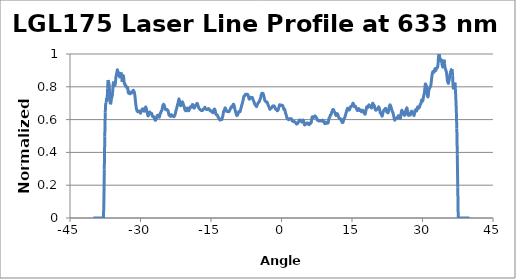
| Category | Normalized Intensity |
|---|---|
| -40.0 | 0 |
| -39.9 | 0 |
| -39.8 | 0 |
| -39.7 | 0 |
| -39.6 | 0 |
| -39.5 | 0 |
| -39.4 | 0 |
| -39.3 | 0 |
| -39.2 | 0 |
| -39.1 | 0 |
| -39.0 | 0 |
| -38.9 | 0 |
| -38.8 | 0 |
| -38.7 | 0 |
| -38.6 | 0 |
| -38.5 | 0 |
| -38.4 | 0 |
| -38.3 | 0 |
| -38.2 | 0 |
| -38.1 | 0 |
| -38.0 | 0 |
| -37.9 | 0 |
| -37.8 | 0.079 |
| -37.7 | 0.297 |
| -37.6 | 0.495 |
| -37.5 | 0.642 |
| -37.4 | 0.703 |
| -37.3 | 0.703 |
| -37.2 | 0.733 |
| -37.1 | 0.712 |
| -37.0 | 0.789 |
| -36.9 | 0.841 |
| -36.8 | 0.832 |
| -36.7 | 0.822 |
| -36.6 | 0.78 |
| -36.5 | 0.723 |
| -36.4 | 0.693 |
| -36.3 | 0.701 |
| -36.2 | 0.725 |
| -36.1 | 0.736 |
| -36.0 | 0.748 |
| -35.9 | 0.778 |
| -35.8 | 0.825 |
| -35.7 | 0.832 |
| -35.6 | 0.816 |
| -35.5 | 0.81 |
| -35.4 | 0.811 |
| -35.3 | 0.836 |
| -35.2 | 0.865 |
| -35.1 | 0.877 |
| -35.0 | 0.893 |
| -34.9 | 0.904 |
| -34.8 | 0.89 |
| -34.7 | 0.888 |
| -34.6 | 0.882 |
| -34.5 | 0.863 |
| -34.4 | 0.862 |
| -34.3 | 0.874 |
| -34.2 | 0.882 |
| -34.1 | 0.888 |
| -34.0 | 0.858 |
| -33.9 | 0.83 |
| -33.8 | 0.841 |
| -33.7 | 0.866 |
| -33.6 | 0.862 |
| -33.5 | 0.832 |
| -33.4 | 0.818 |
| -33.3 | 0.818 |
| -33.2 | 0.805 |
| -33.1 | 0.803 |
| -33.0 | 0.802 |
| -32.9 | 0.794 |
| -32.8 | 0.797 |
| -32.7 | 0.788 |
| -32.6 | 0.766 |
| -32.5 | 0.761 |
| -32.4 | 0.77 |
| -32.3 | 0.759 |
| -32.2 | 0.758 |
| -32.1 | 0.763 |
| -32.0 | 0.761 |
| -31.9 | 0.763 |
| -31.8 | 0.769 |
| -31.7 | 0.772 |
| -31.6 | 0.777 |
| -31.5 | 0.778 |
| -31.4 | 0.772 |
| -31.3 | 0.766 |
| -31.2 | 0.747 |
| -31.1 | 0.72 |
| -31.0 | 0.693 |
| -30.9 | 0.671 |
| -30.8 | 0.659 |
| -30.7 | 0.653 |
| -30.6 | 0.648 |
| -30.5 | 0.648 |
| -30.4 | 0.653 |
| -30.3 | 0.651 |
| -30.2 | 0.653 |
| -30.1 | 0.646 |
| -30.0 | 0.638 |
| -29.9 | 0.645 |
| -29.8 | 0.654 |
| -29.7 | 0.659 |
| -29.6 | 0.665 |
| -29.5 | 0.664 |
| -29.4 | 0.665 |
| -29.3 | 0.657 |
| -29.2 | 0.651 |
| -29.1 | 0.66 |
| -29.0 | 0.67 |
| -28.9 | 0.678 |
| -28.8 | 0.671 |
| -28.7 | 0.66 |
| -28.6 | 0.645 |
| -28.5 | 0.632 |
| -28.4 | 0.623 |
| -28.3 | 0.626 |
| -28.2 | 0.635 |
| -28.1 | 0.645 |
| -28.0 | 0.646 |
| -27.9 | 0.642 |
| -27.8 | 0.635 |
| -27.7 | 0.637 |
| -27.6 | 0.637 |
| -27.5 | 0.626 |
| -27.4 | 0.618 |
| -27.3 | 0.616 |
| -27.2 | 0.618 |
| -27.1 | 0.613 |
| -27.0 | 0.605 |
| -26.9 | 0.597 |
| -26.8 | 0.596 |
| -26.7 | 0.602 |
| -26.6 | 0.608 |
| -26.5 | 0.621 |
| -26.4 | 0.626 |
| -26.3 | 0.626 |
| -26.2 | 0.623 |
| -26.1 | 0.618 |
| -26.0 | 0.615 |
| -25.9 | 0.624 |
| -25.8 | 0.638 |
| -25.7 | 0.64 |
| -25.6 | 0.651 |
| -25.5 | 0.654 |
| -25.4 | 0.662 |
| -25.3 | 0.678 |
| -25.2 | 0.689 |
| -25.1 | 0.693 |
| -25.0 | 0.69 |
| -24.9 | 0.682 |
| -24.8 | 0.671 |
| -24.7 | 0.664 |
| -24.6 | 0.66 |
| -24.5 | 0.662 |
| -24.4 | 0.662 |
| -24.3 | 0.659 |
| -24.2 | 0.657 |
| -24.1 | 0.651 |
| -24.0 | 0.634 |
| -23.9 | 0.626 |
| -23.8 | 0.63 |
| -23.7 | 0.629 |
| -23.6 | 0.62 |
| -23.5 | 0.623 |
| -23.4 | 0.629 |
| -23.3 | 0.627 |
| -23.2 | 0.623 |
| -23.1 | 0.621 |
| -23.0 | 0.62 |
| -22.9 | 0.618 |
| -22.8 | 0.621 |
| -22.7 | 0.626 |
| -22.6 | 0.635 |
| -22.5 | 0.649 |
| -22.4 | 0.66 |
| -22.3 | 0.67 |
| -22.2 | 0.681 |
| -22.1 | 0.693 |
| -22.0 | 0.701 |
| -21.9 | 0.715 |
| -21.8 | 0.726 |
| -21.7 | 0.714 |
| -21.6 | 0.693 |
| -21.5 | 0.686 |
| -21.4 | 0.686 |
| -21.3 | 0.69 |
| -21.2 | 0.703 |
| -21.1 | 0.709 |
| -21.0 | 0.703 |
| -20.9 | 0.695 |
| -20.8 | 0.686 |
| -20.7 | 0.678 |
| -20.6 | 0.667 |
| -20.5 | 0.657 |
| -20.4 | 0.654 |
| -20.3 | 0.654 |
| -20.2 | 0.659 |
| -20.1 | 0.668 |
| -20.0 | 0.67 |
| -19.9 | 0.662 |
| -19.8 | 0.654 |
| -19.7 | 0.656 |
| -19.6 | 0.664 |
| -19.5 | 0.673 |
| -19.4 | 0.678 |
| -19.3 | 0.678 |
| -19.2 | 0.676 |
| -19.1 | 0.676 |
| -19.0 | 0.689 |
| -18.9 | 0.692 |
| -18.8 | 0.684 |
| -18.7 | 0.675 |
| -18.6 | 0.67 |
| -18.5 | 0.673 |
| -18.4 | 0.679 |
| -18.3 | 0.686 |
| -18.2 | 0.69 |
| -18.1 | 0.693 |
| -18.0 | 0.698 |
| -17.9 | 0.698 |
| -17.8 | 0.689 |
| -17.7 | 0.679 |
| -17.6 | 0.671 |
| -17.5 | 0.668 |
| -17.4 | 0.664 |
| -17.3 | 0.66 |
| -17.2 | 0.659 |
| -17.1 | 0.656 |
| -17.0 | 0.657 |
| -16.9 | 0.657 |
| -16.8 | 0.656 |
| -16.7 | 0.662 |
| -16.6 | 0.664 |
| -16.5 | 0.667 |
| -16.4 | 0.67 |
| -16.3 | 0.676 |
| -16.2 | 0.668 |
| -16.1 | 0.664 |
| -16.0 | 0.664 |
| -15.9 | 0.662 |
| -15.8 | 0.662 |
| -15.7 | 0.664 |
| -15.6 | 0.667 |
| -15.5 | 0.667 |
| -15.4 | 0.664 |
| -15.3 | 0.66 |
| -15.2 | 0.654 |
| -15.1 | 0.654 |
| -15.0 | 0.654 |
| -14.9 | 0.649 |
| -14.8 | 0.646 |
| -14.7 | 0.646 |
| -14.6 | 0.642 |
| -14.5 | 0.648 |
| -14.4 | 0.659 |
| -14.3 | 0.664 |
| -14.2 | 0.664 |
| -14.1 | 0.654 |
| -14.0 | 0.637 |
| -13.9 | 0.63 |
| -13.8 | 0.63 |
| -13.7 | 0.629 |
| -13.6 | 0.624 |
| -13.5 | 0.615 |
| -13.4 | 0.613 |
| -13.3 | 0.607 |
| -13.2 | 0.601 |
| -13.1 | 0.597 |
| -13.0 | 0.597 |
| -12.9 | 0.601 |
| -12.8 | 0.602 |
| -12.7 | 0.601 |
| -12.6 | 0.612 |
| -12.5 | 0.62 |
| -12.4 | 0.637 |
| -12.3 | 0.651 |
| -12.2 | 0.656 |
| -12.1 | 0.662 |
| -12.0 | 0.671 |
| -11.9 | 0.668 |
| -11.8 | 0.66 |
| -11.7 | 0.651 |
| -11.6 | 0.649 |
| -11.5 | 0.649 |
| -11.4 | 0.649 |
| -11.3 | 0.649 |
| -11.2 | 0.648 |
| -11.1 | 0.653 |
| -11.0 | 0.659 |
| -10.9 | 0.664 |
| -10.8 | 0.67 |
| -10.7 | 0.678 |
| -10.6 | 0.676 |
| -10.5 | 0.676 |
| -10.4 | 0.684 |
| -10.3 | 0.692 |
| -10.2 | 0.693 |
| -10.1 | 0.687 |
| -10.0 | 0.676 |
| -9.9 | 0.662 |
| -9.8 | 0.651 |
| -9.7 | 0.642 |
| -9.6 | 0.63 |
| -9.5 | 0.626 |
| -9.4 | 0.626 |
| -9.3 | 0.632 |
| -9.2 | 0.64 |
| -9.1 | 0.648 |
| -9.0 | 0.651 |
| -8.9 | 0.648 |
| -8.8 | 0.649 |
| -8.7 | 0.662 |
| -8.6 | 0.671 |
| -8.5 | 0.684 |
| -8.4 | 0.693 |
| -8.3 | 0.703 |
| -8.2 | 0.715 |
| -8.1 | 0.73 |
| -8.0 | 0.742 |
| -7.9 | 0.744 |
| -7.8 | 0.745 |
| -7.7 | 0.753 |
| -7.6 | 0.755 |
| -7.5 | 0.755 |
| -7.4 | 0.753 |
| -7.3 | 0.755 |
| -7.2 | 0.753 |
| -7.1 | 0.747 |
| -7.0 | 0.736 |
| -6.9 | 0.726 |
| -6.8 | 0.725 |
| -6.7 | 0.731 |
| -6.6 | 0.736 |
| -6.5 | 0.736 |
| -6.4 | 0.733 |
| -6.3 | 0.731 |
| -6.2 | 0.734 |
| -6.1 | 0.726 |
| -6.0 | 0.717 |
| -5.9 | 0.711 |
| -5.8 | 0.704 |
| -5.7 | 0.695 |
| -5.6 | 0.69 |
| -5.5 | 0.687 |
| -5.4 | 0.682 |
| -5.3 | 0.679 |
| -5.2 | 0.687 |
| -5.1 | 0.695 |
| -5.0 | 0.7 |
| -4.9 | 0.704 |
| -4.8 | 0.706 |
| -4.7 | 0.712 |
| -4.6 | 0.72 |
| -4.5 | 0.728 |
| -4.4 | 0.739 |
| -4.3 | 0.752 |
| -4.2 | 0.759 |
| -4.1 | 0.761 |
| -4.0 | 0.761 |
| -3.9 | 0.758 |
| -3.8 | 0.748 |
| -3.7 | 0.736 |
| -3.6 | 0.723 |
| -3.5 | 0.714 |
| -3.4 | 0.712 |
| -3.3 | 0.709 |
| -3.2 | 0.706 |
| -3.1 | 0.708 |
| -3.0 | 0.703 |
| -2.9 | 0.693 |
| -2.8 | 0.686 |
| -2.7 | 0.679 |
| -2.6 | 0.673 |
| -2.5 | 0.664 |
| -2.4 | 0.664 |
| -2.3 | 0.668 |
| -2.2 | 0.67 |
| -2.1 | 0.673 |
| -2.0 | 0.676 |
| -1.9 | 0.682 |
| -1.8 | 0.682 |
| -1.7 | 0.682 |
| -1.6 | 0.684 |
| -1.5 | 0.679 |
| -1.4 | 0.675 |
| -1.3 | 0.667 |
| -1.2 | 0.662 |
| -1.1 | 0.662 |
| -1.0 | 0.659 |
| -0.9 | 0.654 |
| -0.8 | 0.656 |
| -0.7 | 0.66 |
| -0.6 | 0.671 |
| -0.5 | 0.681 |
| -0.4 | 0.69 |
| -0.3 | 0.69 |
| -0.2 | 0.687 |
| -0.1 | 0.686 |
| 0.0 | 0.687 |
| 0.1 | 0.687 |
| 0.2 | 0.687 |
| 0.3 | 0.682 |
| 0.4 | 0.671 |
| 0.5 | 0.662 |
| 0.6 | 0.665 |
| 0.7 | 0.662 |
| 0.8 | 0.648 |
| 0.9 | 0.637 |
| 1.0 | 0.629 |
| 1.1 | 0.616 |
| 1.2 | 0.608 |
| 1.3 | 0.605 |
| 1.4 | 0.604 |
| 1.5 | 0.599 |
| 1.6 | 0.601 |
| 1.7 | 0.605 |
| 1.8 | 0.604 |
| 1.9 | 0.604 |
| 2.0 | 0.605 |
| 2.1 | 0.605 |
| 2.2 | 0.601 |
| 2.3 | 0.591 |
| 2.4 | 0.59 |
| 2.5 | 0.59 |
| 2.6 | 0.59 |
| 2.7 | 0.586 |
| 2.8 | 0.585 |
| 2.9 | 0.585 |
| 3.0 | 0.582 |
| 3.1 | 0.577 |
| 3.2 | 0.572 |
| 3.3 | 0.574 |
| 3.4 | 0.575 |
| 3.5 | 0.579 |
| 3.6 | 0.585 |
| 3.7 | 0.591 |
| 3.8 | 0.597 |
| 3.9 | 0.596 |
| 4.0 | 0.594 |
| 4.1 | 0.596 |
| 4.2 | 0.591 |
| 4.3 | 0.585 |
| 4.4 | 0.588 |
| 4.5 | 0.596 |
| 4.6 | 0.597 |
| 4.7 | 0.594 |
| 4.8 | 0.579 |
| 4.9 | 0.568 |
| 5.0 | 0.569 |
| 5.1 | 0.574 |
| 5.2 | 0.575 |
| 5.3 | 0.574 |
| 5.4 | 0.579 |
| 5.5 | 0.58 |
| 5.6 | 0.579 |
| 5.7 | 0.574 |
| 5.8 | 0.571 |
| 5.9 | 0.569 |
| 6.0 | 0.575 |
| 6.1 | 0.58 |
| 6.2 | 0.577 |
| 6.3 | 0.58 |
| 6.4 | 0.597 |
| 6.5 | 0.615 |
| 6.6 | 0.616 |
| 6.7 | 0.612 |
| 6.8 | 0.613 |
| 6.9 | 0.615 |
| 7.0 | 0.62 |
| 7.1 | 0.623 |
| 7.2 | 0.62 |
| 7.3 | 0.616 |
| 7.4 | 0.613 |
| 7.5 | 0.607 |
| 7.6 | 0.597 |
| 7.7 | 0.597 |
| 7.8 | 0.597 |
| 7.9 | 0.593 |
| 8.0 | 0.591 |
| 8.1 | 0.594 |
| 8.2 | 0.593 |
| 8.3 | 0.594 |
| 8.4 | 0.591 |
| 8.5 | 0.591 |
| 8.6 | 0.594 |
| 8.7 | 0.597 |
| 8.8 | 0.594 |
| 8.9 | 0.588 |
| 9.0 | 0.588 |
| 9.1 | 0.583 |
| 9.2 | 0.575 |
| 9.3 | 0.58 |
| 9.4 | 0.585 |
| 9.5 | 0.582 |
| 9.6 | 0.577 |
| 9.7 | 0.579 |
| 9.8 | 0.582 |
| 9.9 | 0.579 |
| 10.0 | 0.591 |
| 10.1 | 0.607 |
| 10.2 | 0.612 |
| 10.3 | 0.618 |
| 10.4 | 0.627 |
| 10.5 | 0.629 |
| 10.6 | 0.635 |
| 10.7 | 0.646 |
| 10.8 | 0.653 |
| 10.9 | 0.66 |
| 11.0 | 0.662 |
| 11.1 | 0.659 |
| 11.2 | 0.649 |
| 11.3 | 0.646 |
| 11.4 | 0.64 |
| 11.5 | 0.63 |
| 11.6 | 0.624 |
| 11.7 | 0.632 |
| 11.8 | 0.637 |
| 11.9 | 0.635 |
| 12.0 | 0.63 |
| 12.1 | 0.618 |
| 12.2 | 0.612 |
| 12.3 | 0.61 |
| 12.4 | 0.604 |
| 12.5 | 0.604 |
| 12.6 | 0.604 |
| 12.7 | 0.599 |
| 12.8 | 0.59 |
| 12.9 | 0.583 |
| 13.0 | 0.582 |
| 13.1 | 0.585 |
| 13.2 | 0.594 |
| 13.3 | 0.607 |
| 13.4 | 0.61 |
| 13.5 | 0.615 |
| 13.6 | 0.626 |
| 13.7 | 0.637 |
| 13.8 | 0.646 |
| 13.9 | 0.657 |
| 14.0 | 0.667 |
| 14.1 | 0.67 |
| 14.2 | 0.667 |
| 14.3 | 0.659 |
| 14.4 | 0.659 |
| 14.5 | 0.662 |
| 14.6 | 0.67 |
| 14.7 | 0.679 |
| 14.8 | 0.681 |
| 14.9 | 0.681 |
| 15.0 | 0.686 |
| 15.1 | 0.693 |
| 15.2 | 0.7 |
| 15.3 | 0.697 |
| 15.4 | 0.684 |
| 15.5 | 0.679 |
| 15.6 | 0.679 |
| 15.7 | 0.682 |
| 15.8 | 0.678 |
| 15.9 | 0.67 |
| 16.0 | 0.665 |
| 16.1 | 0.657 |
| 16.2 | 0.656 |
| 16.3 | 0.66 |
| 16.4 | 0.667 |
| 16.5 | 0.665 |
| 16.6 | 0.656 |
| 16.7 | 0.656 |
| 16.8 | 0.659 |
| 16.9 | 0.654 |
| 17.0 | 0.648 |
| 17.1 | 0.649 |
| 17.2 | 0.656 |
| 17.3 | 0.657 |
| 17.4 | 0.651 |
| 17.5 | 0.645 |
| 17.6 | 0.64 |
| 17.7 | 0.635 |
| 17.8 | 0.634 |
| 17.9 | 0.646 |
| 18.0 | 0.66 |
| 18.1 | 0.676 |
| 18.2 | 0.678 |
| 18.3 | 0.673 |
| 18.4 | 0.676 |
| 18.5 | 0.686 |
| 18.6 | 0.69 |
| 18.7 | 0.686 |
| 18.8 | 0.682 |
| 18.9 | 0.682 |
| 19.0 | 0.678 |
| 19.1 | 0.671 |
| 19.2 | 0.673 |
| 19.3 | 0.687 |
| 19.4 | 0.7 |
| 19.5 | 0.697 |
| 19.6 | 0.69 |
| 19.7 | 0.687 |
| 19.8 | 0.679 |
| 19.9 | 0.667 |
| 20.0 | 0.659 |
| 20.1 | 0.657 |
| 20.2 | 0.66 |
| 20.3 | 0.664 |
| 20.4 | 0.664 |
| 20.5 | 0.665 |
| 20.6 | 0.675 |
| 20.7 | 0.678 |
| 20.8 | 0.67 |
| 20.9 | 0.657 |
| 21.0 | 0.643 |
| 21.1 | 0.637 |
| 21.2 | 0.638 |
| 21.3 | 0.629 |
| 21.4 | 0.62 |
| 21.5 | 0.629 |
| 21.6 | 0.643 |
| 21.7 | 0.653 |
| 21.8 | 0.659 |
| 21.9 | 0.659 |
| 22.0 | 0.664 |
| 22.1 | 0.668 |
| 22.2 | 0.667 |
| 22.3 | 0.657 |
| 22.4 | 0.646 |
| 22.5 | 0.645 |
| 22.6 | 0.642 |
| 22.7 | 0.643 |
| 22.8 | 0.657 |
| 22.9 | 0.673 |
| 23.0 | 0.686 |
| 23.1 | 0.69 |
| 23.2 | 0.684 |
| 23.3 | 0.676 |
| 23.4 | 0.667 |
| 23.5 | 0.656 |
| 23.6 | 0.648 |
| 23.7 | 0.643 |
| 23.8 | 0.63 |
| 23.9 | 0.618 |
| 24.0 | 0.602 |
| 24.1 | 0.596 |
| 24.2 | 0.602 |
| 24.3 | 0.607 |
| 24.4 | 0.608 |
| 24.5 | 0.607 |
| 24.6 | 0.612 |
| 24.7 | 0.616 |
| 24.8 | 0.618 |
| 24.9 | 0.624 |
| 25.0 | 0.621 |
| 25.1 | 0.613 |
| 25.2 | 0.607 |
| 25.3 | 0.608 |
| 25.4 | 0.624 |
| 25.5 | 0.648 |
| 25.6 | 0.657 |
| 25.7 | 0.651 |
| 25.8 | 0.643 |
| 25.9 | 0.637 |
| 26.0 | 0.634 |
| 26.1 | 0.629 |
| 26.2 | 0.626 |
| 26.3 | 0.632 |
| 26.4 | 0.649 |
| 26.5 | 0.66 |
| 26.6 | 0.667 |
| 26.7 | 0.671 |
| 26.8 | 0.654 |
| 26.9 | 0.634 |
| 27.0 | 0.626 |
| 27.1 | 0.63 |
| 27.2 | 0.637 |
| 27.3 | 0.63 |
| 27.4 | 0.627 |
| 27.5 | 0.638 |
| 27.6 | 0.649 |
| 27.7 | 0.651 |
| 27.8 | 0.642 |
| 27.9 | 0.638 |
| 28.0 | 0.64 |
| 28.1 | 0.634 |
| 28.2 | 0.624 |
| 28.3 | 0.637 |
| 28.4 | 0.653 |
| 28.5 | 0.659 |
| 28.6 | 0.66 |
| 28.7 | 0.653 |
| 28.8 | 0.656 |
| 28.9 | 0.671 |
| 29.0 | 0.678 |
| 29.1 | 0.67 |
| 29.2 | 0.67 |
| 29.3 | 0.675 |
| 29.4 | 0.679 |
| 29.5 | 0.692 |
| 29.6 | 0.695 |
| 29.7 | 0.701 |
| 29.8 | 0.719 |
| 29.9 | 0.719 |
| 30.0 | 0.712 |
| 30.1 | 0.719 |
| 30.2 | 0.737 |
| 30.3 | 0.75 |
| 30.4 | 0.763 |
| 30.5 | 0.791 |
| 30.6 | 0.816 |
| 30.7 | 0.814 |
| 30.8 | 0.808 |
| 30.9 | 0.791 |
| 31.0 | 0.761 |
| 31.1 | 0.741 |
| 31.2 | 0.742 |
| 31.3 | 0.767 |
| 31.4 | 0.785 |
| 31.5 | 0.791 |
| 31.6 | 0.797 |
| 31.7 | 0.803 |
| 31.8 | 0.814 |
| 31.9 | 0.838 |
| 32.0 | 0.863 |
| 32.1 | 0.884 |
| 32.2 | 0.893 |
| 32.3 | 0.89 |
| 32.4 | 0.888 |
| 32.5 | 0.892 |
| 32.6 | 0.906 |
| 32.7 | 0.91 |
| 32.8 | 0.899 |
| 32.9 | 0.904 |
| 33.0 | 0.914 |
| 33.1 | 0.917 |
| 33.2 | 0.918 |
| 33.3 | 0.937 |
| 33.4 | 0.98 |
| 33.5 | 1 |
| 33.6 | 0.992 |
| 33.7 | 0.975 |
| 33.8 | 0.961 |
| 33.9 | 0.964 |
| 34.0 | 0.964 |
| 34.1 | 0.948 |
| 34.2 | 0.931 |
| 34.3 | 0.921 |
| 34.4 | 0.923 |
| 34.5 | 0.95 |
| 34.6 | 0.965 |
| 34.7 | 0.94 |
| 34.8 | 0.915 |
| 34.9 | 0.907 |
| 35.0 | 0.898 |
| 35.1 | 0.888 |
| 35.2 | 0.863 |
| 35.3 | 0.838 |
| 35.4 | 0.829 |
| 35.5 | 0.821 |
| 35.6 | 0.833 |
| 35.7 | 0.846 |
| 35.8 | 0.858 |
| 35.9 | 0.88 |
| 36.0 | 0.893 |
| 36.1 | 0.901 |
| 36.2 | 0.907 |
| 36.3 | 0.909 |
| 36.4 | 0.871 |
| 36.5 | 0.805 |
| 36.6 | 0.785 |
| 36.7 | 0.794 |
| 36.8 | 0.786 |
| 36.9 | 0.825 |
| 37.0 | 0.788 |
| 37.1 | 0.723 |
| 37.2 | 0.649 |
| 37.3 | 0.546 |
| 37.4 | 0.388 |
| 37.5 | 0.186 |
| 37.6 | 0 |
| 37.7 | 0 |
| 37.8 | 0 |
| 37.9 | 0 |
| 38.0 | 0 |
| 38.1 | 0 |
| 38.2 | 0 |
| 38.3 | 0 |
| 38.4 | 0 |
| 38.5 | 0 |
| 38.6 | 0 |
| 38.7 | 0 |
| 38.8 | 0 |
| 38.9 | 0 |
| 39.0 | 0 |
| 39.1 | 0 |
| 39.2 | 0 |
| 39.3 | 0 |
| 39.4 | 0 |
| 39.5 | 0 |
| 39.6 | 0 |
| 39.7 | 0 |
| 39.8 | 0 |
| 39.9 | 0 |
| 40.0 | 0 |